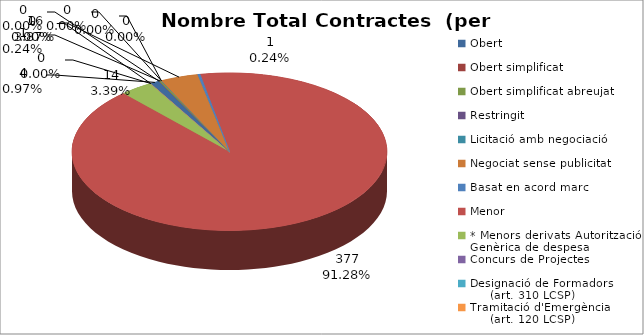
| Category | Nombre Total Contractes |
|---|---|
| Obert | 4 |
| Obert simplificat | 0 |
| Obert simplificat abreujat | 1 |
| Restringit | 0 |
| Licitació amb negociació | 0 |
| Negociat sense publicitat | 16 |
| Basat en acord marc | 1 |
| Menor | 377 |
| * Menors derivats Autorització Genèrica de despesa | 14 |
| Concurs de Projectes | 0 |
| Designació de Formadors
     (art. 310 LCSP) | 0 |
| Tramitació d'Emergència
     (art. 120 LCSP) | 0 |